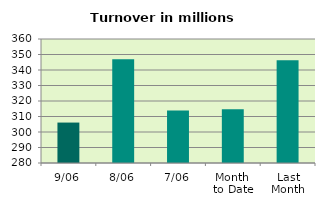
| Category | Series 0 |
|---|---|
| 9/06 | 306.089 |
| 8/06 | 346.962 |
| 7/06 | 313.828 |
| Month 
to Date | 314.602 |
| Last
Month | 346.329 |